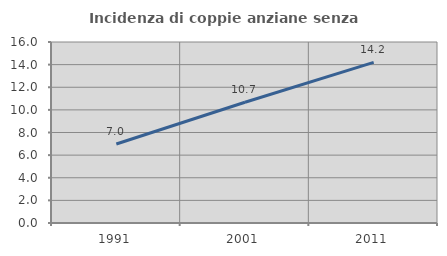
| Category | Incidenza di coppie anziane senza figli  |
|---|---|
| 1991.0 | 6.981 |
| 2001.0 | 10.673 |
| 2011.0 | 14.198 |